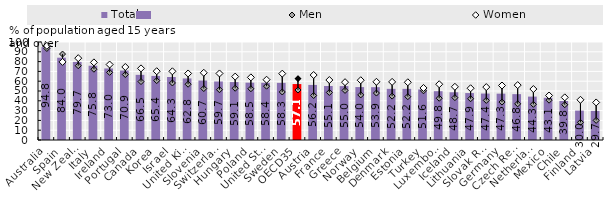
| Category | Total |
|---|---|
| Australia | 94.8 |
| Spain | 84 |
| New Zealand | 79.7 |
| Italy | 75.8 |
| Ireland | 73 |
| Portugal | 70.9 |
| Canada | 66.5 |
| Korea | 65.4 |
| Israel | 64.3 |
| United Kingdom | 62.8 |
| Slovenia | 60.7 |
| Switzerland | 59.7 |
| Hungary | 59.1 |
| Poland | 58.5 |
| United States | 58.4 |
| Sweden | 58.3 |
| OECD35 | 57.1 |
| Austria | 56.2 |
| France | 55.1 |
| Greece | 55 |
| Norway | 54 |
| Belgium | 53.9 |
| Denmark | 52.2 |
| Estonia | 52.2 |
| Turkey | 51.6 |
| Luxembourg | 49.8 |
| Iceland | 48.7 |
| Lithuania | 47.9 |
| Slovak Republic | 47.4 |
| Germany | 47.3 |
| Czech Republic | 46.8 |
| Netherlands | 44.3 |
| Mexico | 43.1 |
| Chile | 39.8 |
| Finland | 30 |
| Latvia | 29.7 |